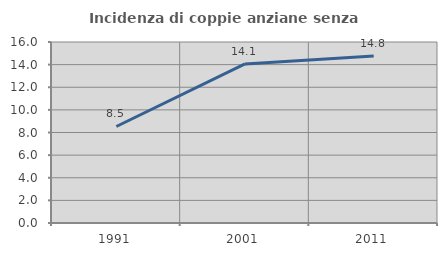
| Category | Incidenza di coppie anziane senza figli  |
|---|---|
| 1991.0 | 8.531 |
| 2001.0 | 14.061 |
| 2011.0 | 14.771 |